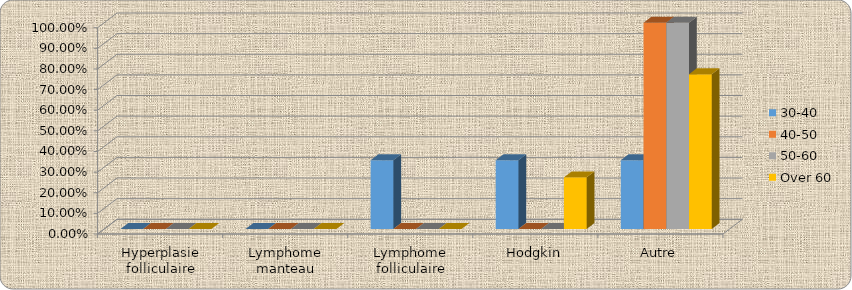
| Category | 30-40 | 40-50 | 50-60 | Over 60 |
|---|---|---|---|---|
| Hyperplasie folliculaire | 0 | 0 | 0 | 0 |
| Lymphome manteau | 0 | 0 | 0 | 0 |
| Lymphome folliculaire | 0.333 | 0 | 0 | 0 |
| Hodgkin | 0.333 | 0 | 0 | 0.25 |
| Autre | 0.333 | 1 | 1 | 0.75 |